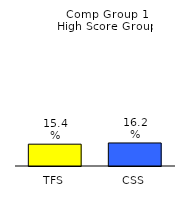
| Category | Series 0 |
|---|---|
| TFS | 0.154 |
| CSS | 0.162 |